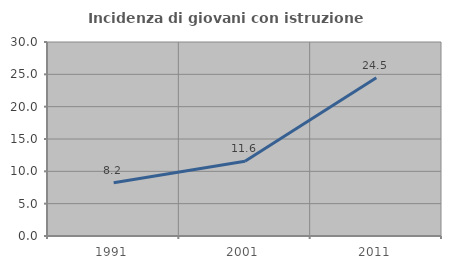
| Category | Incidenza di giovani con istruzione universitaria |
|---|---|
| 1991.0 | 8.239 |
| 2001.0 | 11.575 |
| 2011.0 | 24.464 |